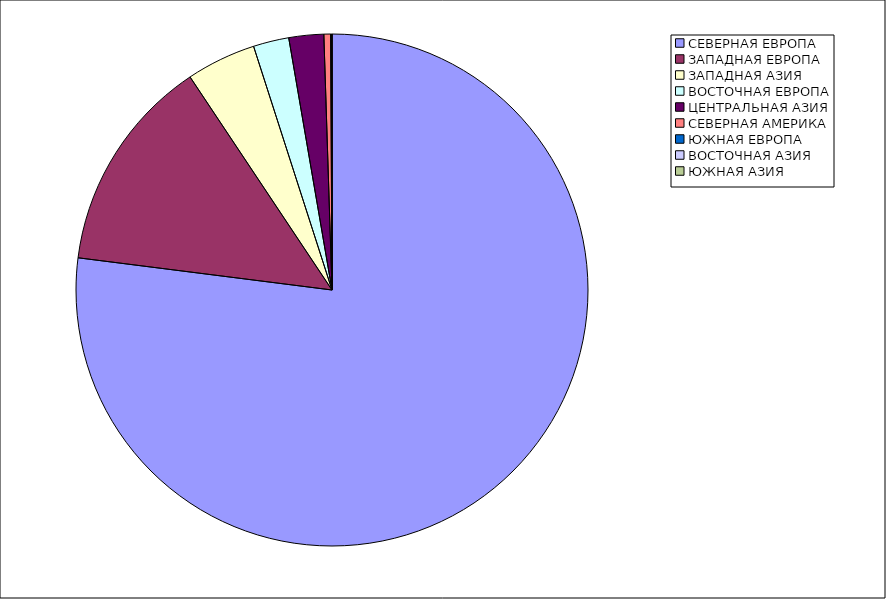
| Category | Оборот |
|---|---|
| СЕВЕРНАЯ ЕВРОПА | 77.007 |
| ЗАПАДНАЯ ЕВРОПА | 13.638 |
| ЗАПАДНАЯ АЗИЯ | 4.399 |
| ВОСТОЧНАЯ ЕВРОПА | 2.25 |
| ЦЕНТРАЛЬНАЯ АЗИЯ | 2.197 |
| СЕВЕРНАЯ АМЕРИКА | 0.425 |
| ЮЖНАЯ ЕВРОПА | 0.055 |
| ВОСТОЧНАЯ АЗИЯ | 0.029 |
| ЮЖНАЯ АЗИЯ | 0 |